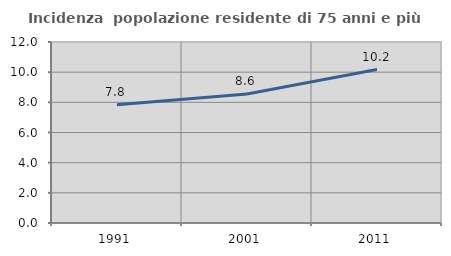
| Category | Incidenza  popolazione residente di 75 anni e più |
|---|---|
| 1991.0 | 7.842 |
| 2001.0 | 8.552 |
| 2011.0 | 10.171 |